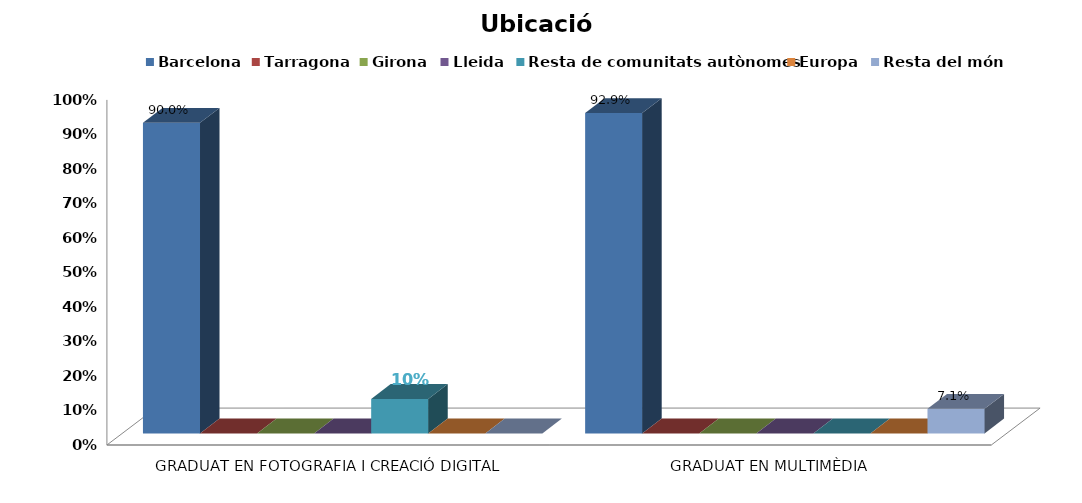
| Category | Barcelona | Tarragona | Girona | Lleida | Resta de comunitats autònomes | Europa | Resta del món |
|---|---|---|---|---|---|---|---|
| GRADUAT EN FOTOGRAFIA I CREACIÓ DIGITAL | 0.9 | 0 | 0 | 0 | 0.1 | 0 | 0 |
| GRADUAT EN MULTIMÈDIA | 0.929 | 0 | 0 | 0 | 0 | 0 | 0.071 |